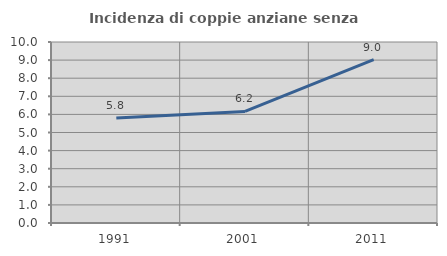
| Category | Incidenza di coppie anziane senza figli  |
|---|---|
| 1991.0 | 5.806 |
| 2001.0 | 6.164 |
| 2011.0 | 9.032 |